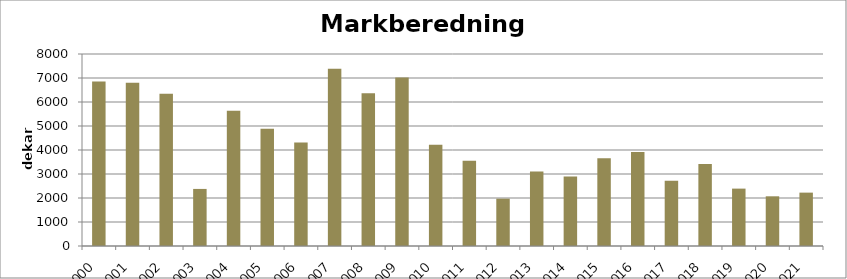
| Category | Totalt |
|---|---|
| 2000 | 6854 |
| 2001 | 6799 |
| 2002 | 6345 |
| 2003 | 2378 |
| 2004 | 5637 |
| 2005 | 4888 |
| 2006 | 4313 |
| 2007 | 7386 |
| 2008 | 6365 |
| 2009 | 7018 |
| 2010 | 4223 |
| 2011 | 3551 |
| 2012 | 1972 |
| 2013 | 3101 |
| 2014 | 2894 |
| 2015 | 3660 |
| 2016 | 3916 |
| 2017 | 2714 |
| 2018 | 3416 |
| 2019 | 2391 |
| 2020 | 2071 |
| 2021 | 2224 |